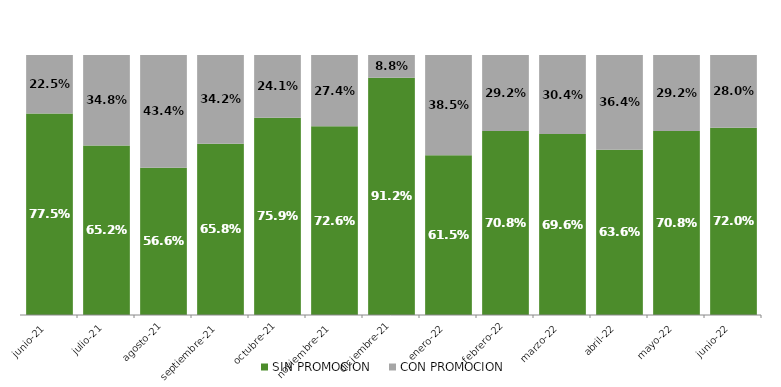
| Category | SIN PROMOCION   | CON PROMOCION   |
|---|---|---|
| 2021-06-01 | 0.775 | 0.225 |
| 2021-07-01 | 0.652 | 0.348 |
| 2021-08-01 | 0.566 | 0.434 |
| 2021-09-01 | 0.658 | 0.342 |
| 2021-10-01 | 0.759 | 0.241 |
| 2021-11-01 | 0.726 | 0.274 |
| 2021-12-01 | 0.912 | 0.088 |
| 2022-01-01 | 0.615 | 0.385 |
| 2022-02-01 | 0.708 | 0.292 |
| 2022-03-01 | 0.696 | 0.304 |
| 2022-04-01 | 0.636 | 0.364 |
| 2022-05-01 | 0.708 | 0.292 |
| 2022-06-01 | 0.72 | 0.28 |